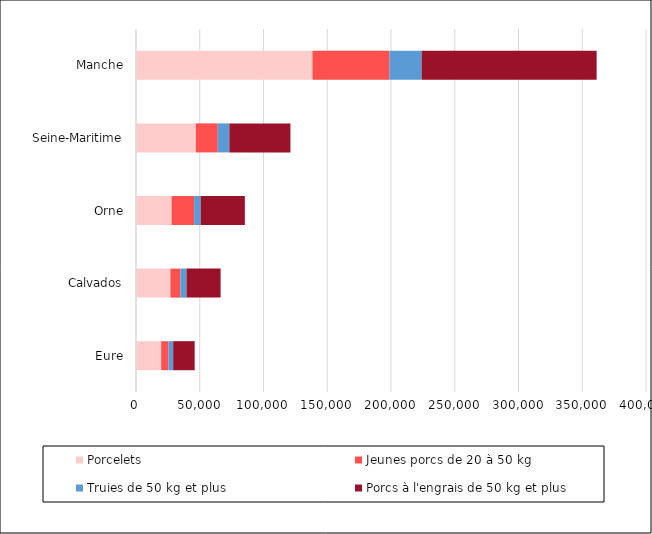
| Category | Porcelets | Jeunes porcs de 20 à 50 kg | Truies de 50 kg et plus | Porcs à l'engrais de 50 kg et plus |
|---|---|---|---|---|
| Eure | 19751 | 5774 | 3651 | 16845 |
| Calvados | 26987 | 7785 | 4861 | 26731 |
| Orne | 27910 | 17672 | 5118 | 34669 |
| Seine-Maritime | 46932 | 17197 | 9087 | 47912 |
| Manche | 138390 | 60420 | 25187 | 137291 |